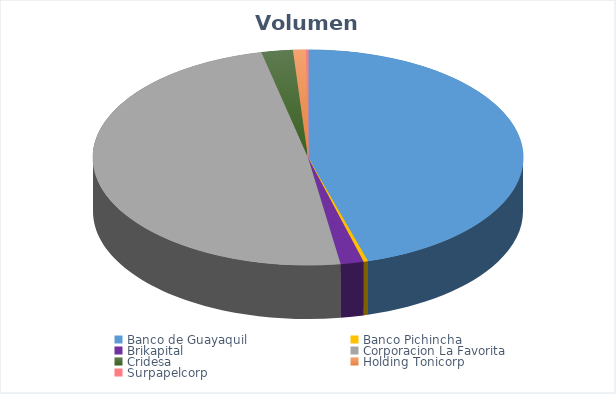
| Category | VOLUMEN ($USD) |
|---|---|
| Banco de Guayaquil | 52674.05 |
| Banco Pichincha | 399 |
| Brikapital | 2000 |
| Corporacion La Favorita | 56650.36 |
| Cridesa | 2720 |
| Holding Tonicorp | 1125 |
| Surpapelcorp | 170 |